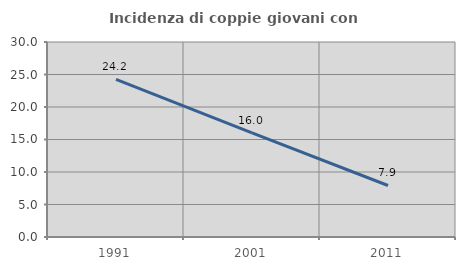
| Category | Incidenza di coppie giovani con figli |
|---|---|
| 1991.0 | 24.249 |
| 2001.0 | 16.013 |
| 2011.0 | 7.926 |